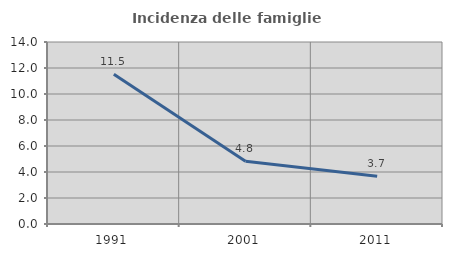
| Category | Incidenza delle famiglie numerose |
|---|---|
| 1991.0 | 11.513 |
| 2001.0 | 4.826 |
| 2011.0 | 3.676 |